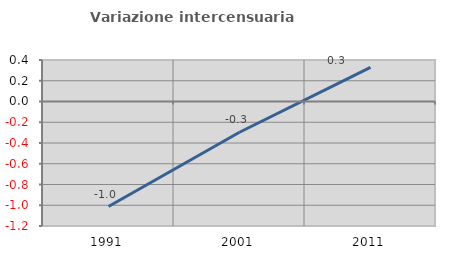
| Category | Variazione intercensuaria annua |
|---|---|
| 1991.0 | -1.013 |
| 2001.0 | -0.296 |
| 2011.0 | 0.33 |